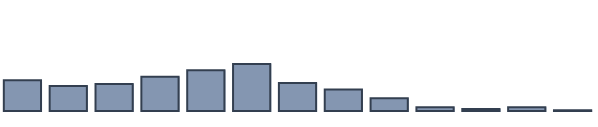
| Category | Series 0 |
|---|---|
| 0 | 11.061 |
| 1 | 9.015 |
| 2 | 9.773 |
| 3 | 12.348 |
| 4 | 14.697 |
| 5 | 16.97 |
| 6 | 10.076 |
| 7 | 7.727 |
| 8 | 4.621 |
| 9 | 1.364 |
| 10 | 0.682 |
| 11 | 1.364 |
| 12 | 0.303 |